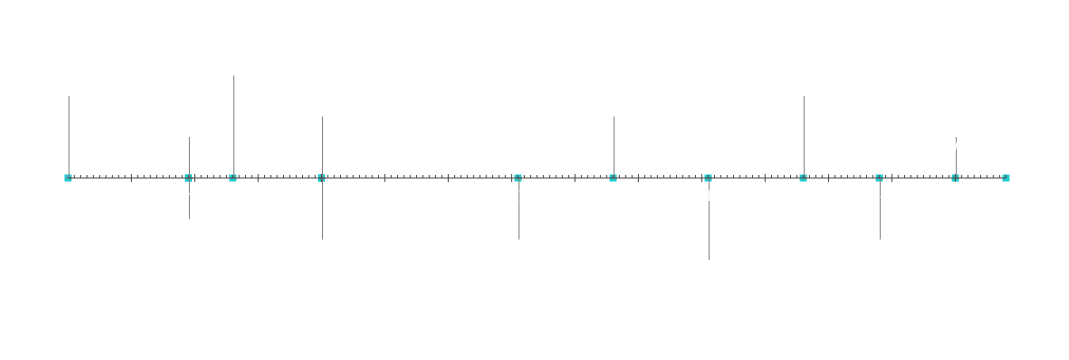
| Category | Placering |
|---|---|
| Projektstart | 20 |
| Milepæl 1 | 10 |
| Milepæl 2 | -10 |
| Milepæl 3 | 25 |
| Milepæl 4 | -15 |
| Milepæl 5 | 15 |
| Milepæl 6 | -15 |
| Milepæl 7 | 15 |
| Milepæl 8 | -20 |
| Milepæl 9 | 20 |
| Milepæl 10 | -15 |
| Milepæl 11 | 10 |
| Projektslut | 5 |